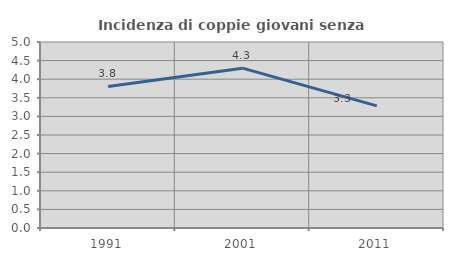
| Category | Incidenza di coppie giovani senza figli |
|---|---|
| 1991.0 | 3.805 |
| 2001.0 | 4.297 |
| 2011.0 | 3.282 |